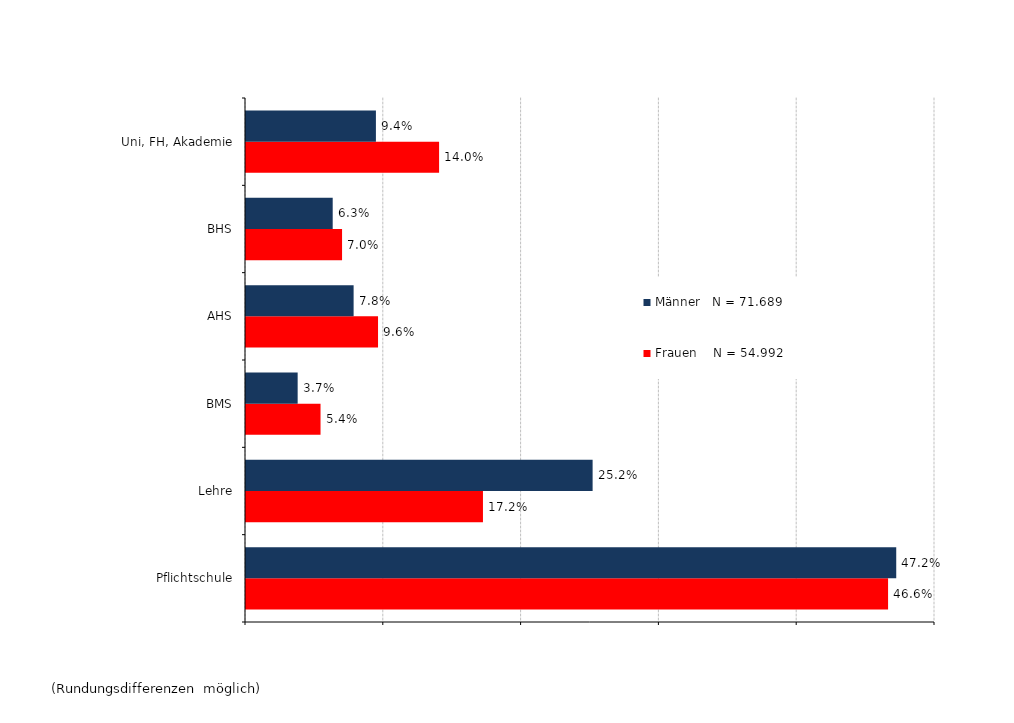
| Category | Frauen    N = 54.992 | Männer   N = 71.689 |
|---|---|---|
| Pflichtschule | 0.466 | 0.472 |
| Lehre | 0.172 | 0.252 |
| BMS | 0.054 | 0.037 |
| AHS | 0.096 | 0.078 |
| BHS | 0.07 | 0.063 |
| Uni, FH, Akademie | 0.14 | 0.094 |